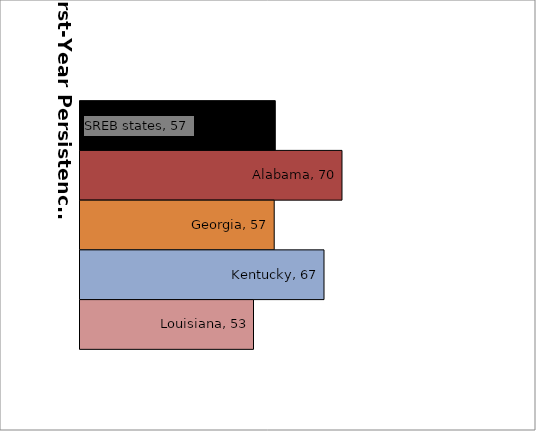
| Category | SREB states | Alabama | Georgia | Kentucky | Louisiana |
|---|---|---|---|---|---|
| 0 | 57.284 | 70.021 | 57.081 | 66.588 | 53.128 |